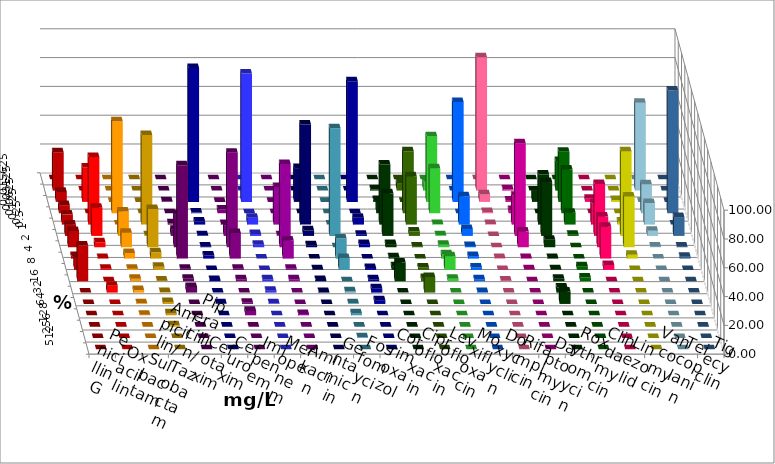
| Category | Penicillin G | Oxacillin | Ampicillin/ Sulbactam | Piperacillin/ Tazobactam | Cefotaxim | Cefuroxim | Imipenem | Meropenem | Amikacin | Gentamicin | Fosfomycin | Cotrimoxazol | Ciprofloxacin | Levofloxacin | Moxifloxacin | Doxycyclin | Rifampicin | Daptomycin | Roxythromycin | Clindamycin | Linezolid | Vancomycin | Teicoplanin | Tigecyclin |
|---|---|---|---|---|---|---|---|---|---|---|---|---|---|---|---|---|---|---|---|---|---|---|---|---|
| 0.015625 | 0 | 0 | 0 | 0 | 0 | 0 | 0 | 0 | 0 | 0 | 0 | 0 | 0 | 0 | 0 | 0 | 0 | 0 | 0 | 0 | 0 | 0 | 0 | 0 |
| 0.03125 | 26.522 | 0 | 0 | 0 | 0 | 0 | 0 | 0 | 0 | 0 | 0 | 0 | 0.87 | 5.217 | 6.087 | 0 | 92.609 | 0.87 | 0 | 20.435 | 0 | 0 | 0 | 60.965 |
| 0.0625 | 6.957 | 23.913 | 0 | 0 | 0.435 | 0 | 93.043 | 89.13 | 0 | 23.478 | 0 | 83.843 | 1.304 | 0 | 45.652 | 69.432 | 5.217 | 0.87 | 7.826 | 34.783 | 2.174 | 1.304 | 0 | 0 |
| 0.125 | 5.652 | 0 | 63.913 | 0 | 0 | 2.609 | 0.435 | 0 | 0 | 0 | 0 | 0 | 7.826 | 43.043 | 31.304 | 0 | 0.87 | 2.174 | 0 | 30.435 | 0 | 0 | 85.217 | 20.175 |
| 0.25 | 6.957 | 46.957 | 0 | 62.174 | 0.87 | 0.435 | 2.174 | 4.783 | 26.087 | 69.565 | 0 | 4.803 | 41.739 | 33.478 | 0.435 | 19.651 | 0.435 | 20 | 34.783 | 8.261 | 14.783 | 2.174 | 0 | 14.912 |
| 0.5 | 7.826 | 19.565 | 16.957 | 0.435 | 4.348 | 7.391 | 0.435 | 1.304 | 0.435 | 3.913 | 74.783 | 0.873 | 29.565 | 3.043 | 0.435 | 4.803 | 0 | 64.348 | 37.391 | 0.87 | 36.087 | 58.696 | 13.043 | 3.509 |
| 1.0 | 11.304 | 3.478 | 10 | 26.522 | 23.043 | 65.652 | 0.435 | 1.739 | 57.826 | 1.304 | 0 | 2.183 | 2.174 | 0.435 | 1.739 | 0.873 | 0 | 10.87 | 5.217 | 0 | 21.304 | 35.217 | 0.435 | 0.439 |
| 2.0 | 1.739 | 0.435 | 3.913 | 4.348 | 64.783 | 17.826 | 2.174 | 0 | 12.609 | 0 | 13.913 | 0 | 0.87 | 0 | 3.043 | 1.747 | 0.435 | 0.435 | 0.435 | 0 | 22.174 | 2.609 | 1.304 | 0 |
| 4.0 | 8.261 | 0.87 | 0.87 | 2.174 | 0.87 | 0.87 | 0 | 0 | 0.87 | 0.435 | 8.261 | 1.31 | 2.609 | 1.739 | 9.565 | 1.747 | 0 | 0.435 | 0.435 | 2.609 | 3.478 | 0 | 0 | 0 |
| 8.0 | 24.783 | 0 | 1.739 | 0.435 | 1.739 | 1.304 | 0.87 | 1.304 | 1.304 | 0.87 | 0 | 1.31 | 13.043 | 2.174 | 1.739 | 1.31 | 0.435 | 0 | 1.739 | 2.609 | 0 | 0 | 0 | 0 |
| 16.0 | 0 | 4.783 | 1.739 | 0.435 | 3.913 | 0 | 0 | 1.304 | 0 | 0.435 | 0.87 | 3.057 | 0 | 10.87 | 0 | 0.437 | 0 | 0 | 3.478 | 0 | 0 | 0 | 0 | 0 |
| 32.0 | 0 | 0 | 0.435 | 1.304 | 0 | 0.87 | 0.435 | 0.435 | 0 | 0 | 0.435 | 2.62 | 0 | 0 | 0 | 0 | 0 | 0 | 8.696 | 0 | 0 | 0 | 0 | 0 |
| 64.0 | 0 | 0 | 0.435 | 1.304 | 0 | 3.043 | 0 | 0 | 0.87 | 0 | 1.304 | 0 | 0 | 0 | 0 | 0 | 0 | 0 | 0 | 0 | 0 | 0 | 0 | 0 |
| 128.0 | 0 | 0 | 0 | 0.87 | 0 | 0 | 0 | 0 | 0 | 0 | 0 | 0 | 0 | 0 | 0 | 0 | 0 | 0 | 0 | 0 | 0 | 0 | 0 | 0 |
| 256.0 | 0 | 0 | 0 | 0 | 0 | 0 | 0 | 0 | 0 | 0 | 0.435 | 0 | 0 | 0 | 0 | 0 | 0 | 0 | 0 | 0 | 0 | 0 | 0 | 0 |
| 512.0 | 0 | 0 | 0 | 0 | 0 | 0 | 0 | 0 | 0 | 0 | 0 | 0 | 0 | 0 | 0 | 0 | 0 | 0 | 0 | 0 | 0 | 0 | 0 | 0 |